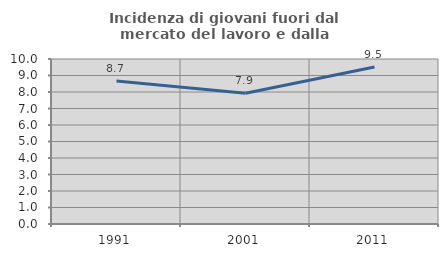
| Category | Incidenza di giovani fuori dal mercato del lavoro e dalla formazione  |
|---|---|
| 1991.0 | 8.661 |
| 2001.0 | 7.922 |
| 2011.0 | 9.518 |